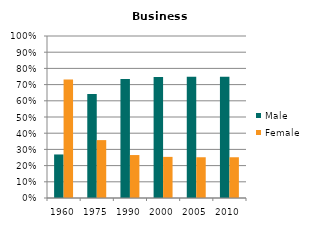
| Category | Male | Female |
|---|---|---|
| 1960.0 | 0.269 | 0.731 |
| 1975.0 | 0.643 | 0.357 |
| 1990.0 | 0.735 | 0.265 |
| 2000.0 | 0.746 | 0.254 |
| 2005.0 | 0.748 | 0.252 |
| 2010.0 | 0.748 | 0.252 |